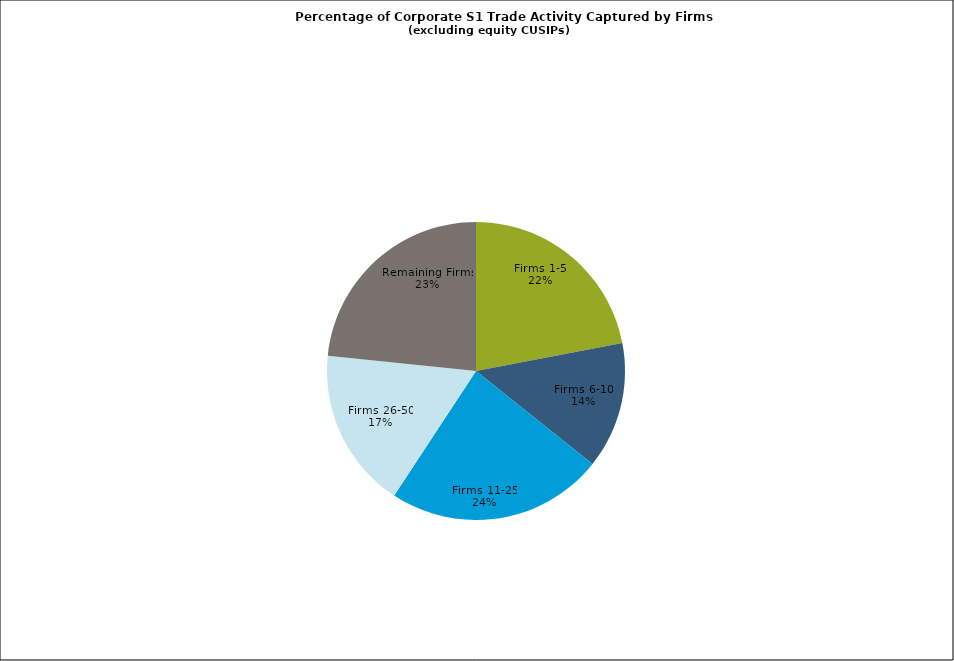
| Category | Series 0 |
|---|---|
| Firms 1-5 | 0.22 |
| Firms 6-10 | 0.137 |
| Firms 11-25 | 0.235 |
| Firms 26-50 | 0.174 |
| Remaining Firms | 0.234 |